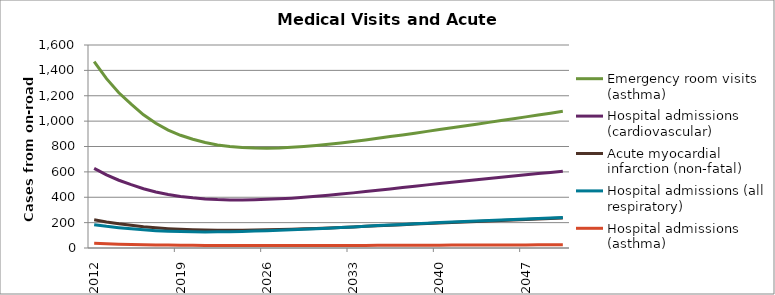
| Category | Emergency room visits (asthma) | Hospital admissions (cardiovascular) | Acute myocardial infarction (non-fatal) | Hospital admissions (all respiratory) | Hospital admissions (asthma) |
|---|---|---|---|---|---|
| 2012.0 | 1469.795 | 627.577 | 223.159 | 183.771 | 37.003 |
| 2013.0 | 1334.9 | 576.386 | 205.517 | 170.558 | 33.439 |
| 2014.0 | 1223.809 | 534.02 | 190.903 | 159.692 | 30.509 |
| 2015.0 | 1133.224 | 499.447 | 178.963 | 150.882 | 28.121 |
| 2016.0 | 1050.017 | 467.304 | 167.99 | 142.963 | 25.988 |
| 2017.0 | 982.947 | 441.613 | 159.25 | 136.792 | 24.269 |
| 2018.0 | 929.717 | 421.594 | 152.505 | 132.253 | 22.901 |
| 2019.0 | 888.503 | 406.593 | 147.555 | 129.255 | 21.836 |
| 2020.0 | 857.159 | 395.765 | 144.111 | 127.593 | 21.017 |
| 2021.0 | 831.041 | 387.159 | 141.591 | 126.876 | 20.356 |
| 2022.0 | 812.141 | 381.805 | 140.262 | 127.248 | 19.869 |
| 2023.0 | 799.329 | 379.197 | 139.931 | 128.514 | 19.53 |
| 2024.0 | 791.504 | 378.857 | 140.408 | 130.465 | 19.312 |
| 2025.0 | 787.968 | 380.536 | 141.603 | 133.012 | 19.197 |
| 2026.0 | 786.911 | 383.265 | 143.25 | 135.974 | 19.17 |
| 2027.0 | 788.843 | 387.485 | 145.429 | 139.381 | 19.212 |
| 2028.0 | 793.25 | 393.03 | 148.083 | 143.194 | 19.309 |
| 2029.0 | 799.6 | 399.728 | 151.16 | 147.365 | 19.446 |
| 2030.0 | 807.578 | 407.468 | 154.618 | 151.856 | 19.614 |
| 2031.0 | 817.059 | 415.707 | 158.3 | 156.475 | 19.842 |
| 2032.0 | 827.626 | 424.705 | 162.246 | 161.287 | 20.086 |
| 2033.0 | 839.306 | 434.429 | 166.436 | 166.264 | 20.347 |
| 2034.0 | 851.846 | 444.709 | 170.797 | 171.338 | 20.621 |
| 2035.0 | 865.011 | 455.42 | 175.283 | 176.464 | 20.902 |
| 2036.0 | 878.04 | 465.582 | 179.561 | 181.244 | 21.204 |
| 2037.0 | 891.428 | 475.993 | 183.886 | 185.987 | 21.509 |
| 2038.0 | 905.168 | 486.669 | 188.28 | 190.742 | 21.813 |
| 2039.0 | 919.234 | 497.531 | 192.722 | 195.504 | 22.116 |
| 2040.0 | 933.598 | 508.456 | 197.167 | 200.23 | 22.417 |
| 2041.0 | 947.365 | 518.279 | 201.214 | 204.453 | 22.734 |
| 2042.0 | 961.36 | 528.235 | 205.303 | 208.707 | 23.046 |
| 2043.0 | 975.663 | 538.293 | 209.409 | 212.966 | 23.355 |
| 2044.0 | 990.149 | 548.321 | 213.467 | 217.162 | 23.663 |
| 2045.0 | 1004.834 | 558.341 | 217.49 | 221.321 | 23.97 |
| 2046.0 | 1019.071 | 567.579 | 221.271 | 225.221 | 24.299 |
| 2047.0 | 1033.408 | 576.934 | 225.089 | 229.191 | 24.622 |
| 2048.0 | 1047.826 | 586.375 | 228.927 | 233.224 | 24.941 |
| 2049.0 | 1062.365 | 595.777 | 232.72 | 237.234 | 25.257 |
| 2050.0 | 1077.051 | 605.024 | 236.406 | 241.136 | 25.572 |